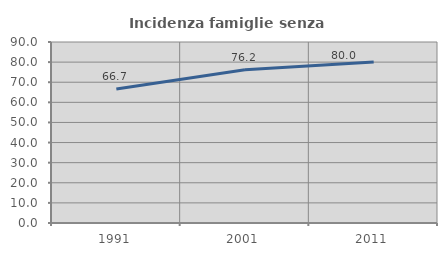
| Category | Incidenza famiglie senza nuclei |
|---|---|
| 1991.0 | 66.667 |
| 2001.0 | 76.238 |
| 2011.0 | 80 |